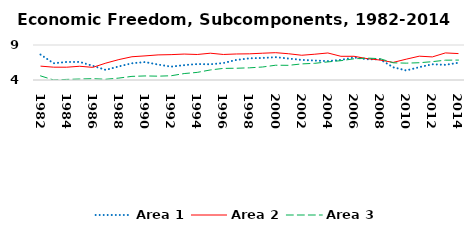
| Category | Area 1 | Area 2 | Area 3 |
|---|---|---|---|
| 1982.0 | 7.628 | 5.98 | 4.588 |
| 1983.0 | 6.392 | 5.831 | 4.005 |
| 1984.0 | 6.577 | 5.827 | 4.085 |
| 1985.0 | 6.58 | 5.963 | 4.141 |
| 1986.0 | 6.023 | 5.806 | 4.191 |
| 1987.0 | 5.438 | 6.412 | 4.109 |
| 1988.0 | 5.943 | 6.919 | 4.275 |
| 1989.0 | 6.391 | 7.322 | 4.519 |
| 1990.0 | 6.563 | 7.445 | 4.58 |
| 1991.0 | 6.206 | 7.585 | 4.548 |
| 1992.0 | 5.906 | 7.623 | 4.607 |
| 1993.0 | 6.125 | 7.704 | 4.92 |
| 1994.0 | 6.279 | 7.645 | 5.087 |
| 1995.0 | 6.249 | 7.827 | 5.435 |
| 1996.0 | 6.424 | 7.647 | 5.658 |
| 1997.0 | 6.87 | 7.717 | 5.679 |
| 1998.0 | 7.1 | 7.74 | 5.74 |
| 1999.0 | 7.15 | 7.828 | 5.857 |
| 2000.0 | 7.263 | 7.904 | 6.111 |
| 2001.0 | 7.065 | 7.748 | 6.096 |
| 2002.0 | 6.868 | 7.534 | 6.299 |
| 2003.0 | 6.782 | 7.685 | 6.385 |
| 2004.0 | 6.696 | 7.86 | 6.587 |
| 2005.0 | 6.873 | 7.385 | 6.762 |
| 2006.0 | 7.216 | 7.388 | 7.026 |
| 2007.0 | 6.966 | 7.052 | 7.13 |
| 2008.0 | 6.951 | 6.849 | 7.045 |
| 2009.0 | 5.821 | 6.512 | 6.457 |
| 2010.0 | 5.364 | 6.974 | 6.407 |
| 2011.0 | 5.835 | 7.403 | 6.466 |
| 2012.0 | 6.247 | 7.299 | 6.62 |
| 2013.0 | 6.165 | 7.87 | 6.831 |
| 2014.0 | 6.467 | 7.773 | 6.845 |